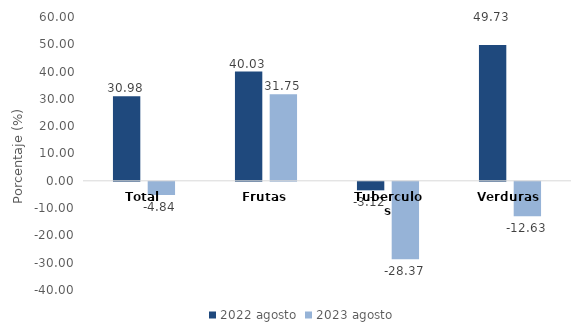
| Category | 2022 | 2023 |
|---|---|---|
| Total | 30.982 | -4.839 |
| Frutas | 40.03 | 31.746 |
| Tuberculos | -3.116 | -28.373 |
| Verduras | 49.725 | -12.629 |